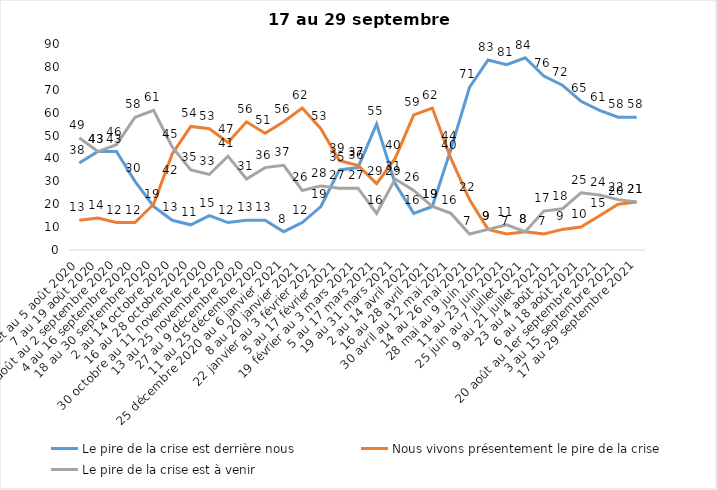
| Category | Le pire de la crise est derrière nous | Nous vivons présentement le pire de la crise | Le pire de la crise est à venir |
|---|---|---|---|
| 24 juillet au 5 août 2020 | 38 | 13 | 49 |
| 7 au 19 août 2020 | 43 | 14 | 43 |
| 21 août au 2 septembre 2020 | 43 | 12 | 46 |
| 4 au 16 septembre 2020 | 30 | 12 | 58 |
| 18 au 30 septembre 2020 | 19 | 20 | 61 |
| 2 au 14 octobre 2020 | 13 | 42 | 45 |
| 16 au 28 octobre 2020 | 11 | 54 | 35 |
| 30 octobre au 11 novembre 2020 | 15 | 53 | 33 |
| 13 au 25 novembre 2020 | 12 | 47 | 41 |
| 27 au 9 décembre 2020 | 13 | 56 | 31 |
| 11 au 25 décembre 2020 | 13 | 51 | 36 |
| 25 décembre 2020 au 6 janvier 2021 | 8 | 56 | 37 |
| 8 au 20 janvier 2021 | 12 | 62 | 26 |
| 22 janvier au 3 février 2021 | 19 | 53 | 28 |
| 5 au 17 février 2021 | 35 | 39 | 27 |
| 19 février au 3 mars 2021 | 36 | 37 | 27 |
| 5 au 17 mars 2021 | 55 | 29 | 16 |
| 19 au 31 mars 2021 | 29 | 40 | 31 |
| 2 au 14 avril 2021 | 16 | 59 | 26 |
| 16 au 28 avril 2021 | 19 | 62 | 19 |
| 30 avril au 12 mai 2021 | 44 | 40 | 16 |
| 14 au 26 mai 2021 | 71 | 22 | 7 |
| 28 mai au 9 juin 2021 | 83 | 9 | 9 |
| 11 au 23 juin 2021 | 81 | 7 | 11 |
| 25 juin au 7 juillet 2021 | 84 | 8 | 8 |
| 9 au 21 juillet 2021 | 76 | 7 | 17 |
| 23 au 4 août 2021 | 72 | 9 | 18 |
| 6 au 18 août 2021 | 65 | 10 | 25 |
| 20 août au 1er septembre 2021 | 61 | 15 | 24 |
| 3 au 15 septembre 2021 | 58 | 20 | 22 |
| 17 au 29 septembre 2021 | 58 | 21 | 21 |